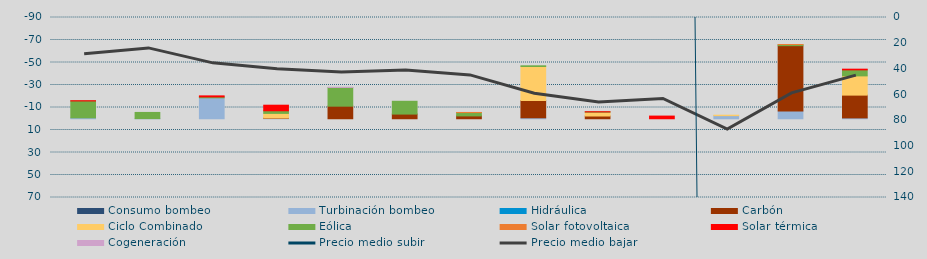
| Category | Consumo bombeo | Turbinación bombeo | Hidráulica | Carbón | Ciclo Combinado | Eólica | Solar fotovoltaica | Solar térmica | Cogeneración |
|---|---|---|---|---|---|---|---|---|---|
| 0 |  | -829.1 |  | 0 | 0 | -14998.4 | 0 | -168 | 0 |
| 1 |  | -135 |  | 0 | 0 | -5477.7 | 0 | 0 | 0 |
| 2 |  | -18605.4 |  | 0 | 0 | -822 | 0 | -899 | 0 |
| 3 |  | -366.7 |  | -294 | -4100.8 | -2338.3 | 0 | -4944.9 | 0 |
| 4 |  | 0 |  | -11178.1 | 0 | -16656.7 | 0 | 0 | -91.5 |
| 5 |  | 0 |  | -4145.2 | 0 | -11379.4 | 0 | 0 | 0 |
| 6 |  | 0 |  | -2530 | 0 | -2970.9 | -95.9 | 0 | 0 |
| 7 |  | -856 |  | -15307.2 | -30295.6 | -607.6 | 0 | 0 | 0 |
| 8 |  | 0 |  | -2438 | -3386 | -274 | 0 | -117.8 | 0 |
| 9 |  | 0 |  | 0 | 0 | 0 | 0 | -2368.1 | 0 |
| 10 |  | -2763.2 |  | 0 | -400 | 0 | 0 | 0 | 0 |
| 11 |  | -6933.6 |  | -58033.7 | 0 | -988.1 | -57.8 | 0 | 0 |
| 12 |  | -755.1 |  | -20255.7 | -17094 | -5344.3 | 0 | -617.6 | 0 |